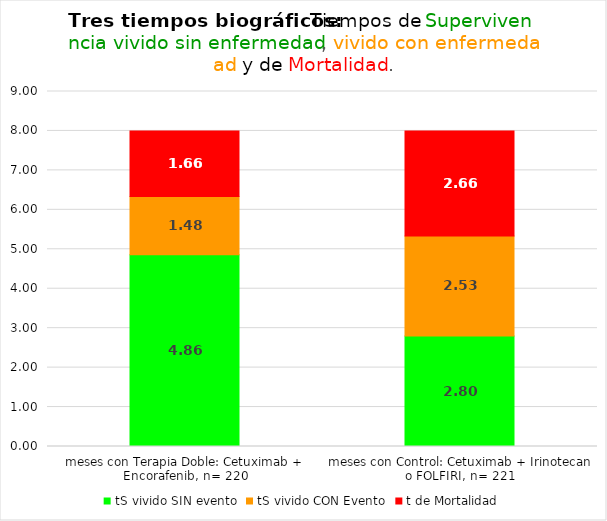
| Category | tS vivido SIN evento | tS vivido CON Evento | t de Mortalidad |
|---|---|---|---|
| meses con Terapia Doble: Cetuximab + Encorafenib, n= 220 | 4.86 | 1.475 | 1.665 |
| meses con Control: Cetuximab + Irinotecan o FOLFIRI, n= 221 | 2.803 | 2.534 | 2.663 |